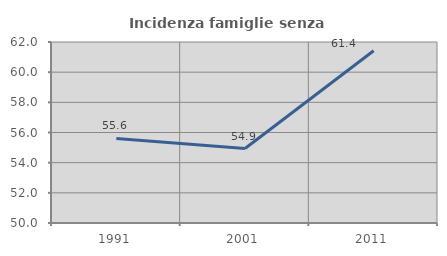
| Category | Incidenza famiglie senza nuclei |
|---|---|
| 1991.0 | 55.607 |
| 2001.0 | 54.937 |
| 2011.0 | 61.417 |